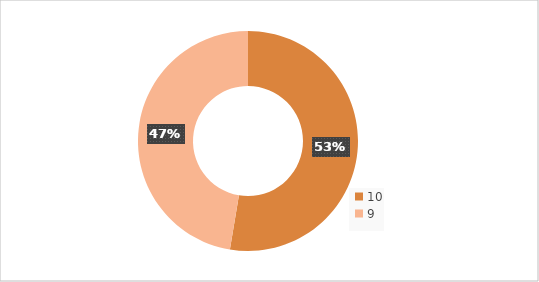
| Category | Series 0 |
|---|---|
| 10.0 | 10 |
| 9.0 | 9 |